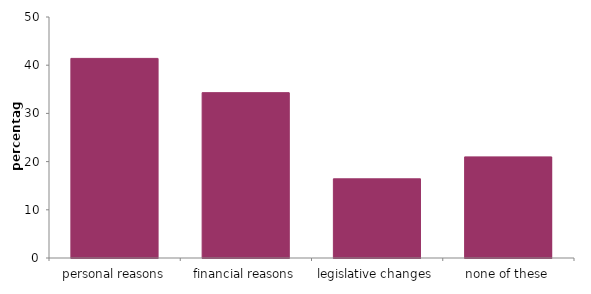
| Category | Series 0 |
|---|---|
| personal reasons | 41.412 |
| financial reasons | 34.301 |
| legislative changes | 16.426 |
| none of these | 20.98 |